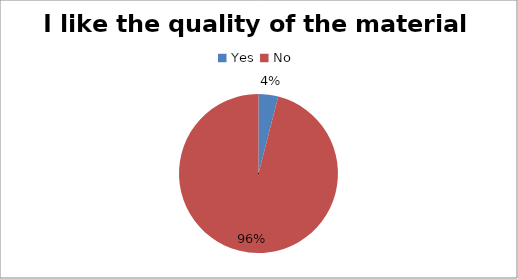
| Category | Series 0 |
|---|---|
| Yes  | 1 |
| No  | 24 |